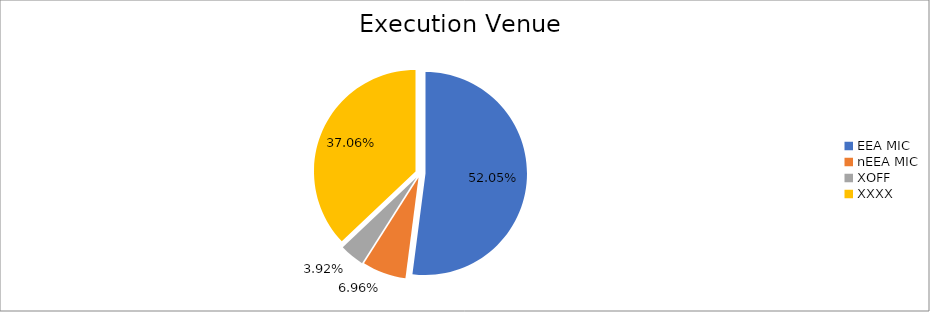
| Category | Series 0 |
|---|---|
| EEA MIC | 7283390.991 |
| nEEA MIC | 973790.72 |
| XOFF | 548738.351 |
| XXXX | 5185965.692 |